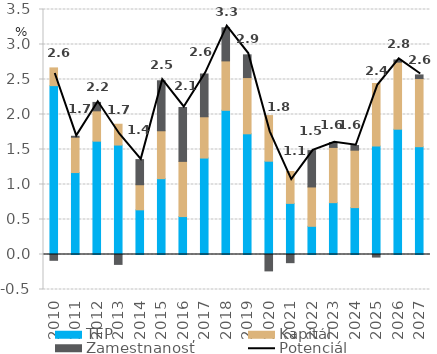
| Category | TFP | Kapitál | Zamestnanosť |
|---|---|---|---|
| 2010.0 | 2.412 | 0.253 | -0.083 |
| 2011.0 | 1.171 | 0.505 | 0.014 |
| 2012.0 | 1.619 | 0.434 | 0.12 |
| 2013.0 | 1.564 | 0.297 | -0.141 |
| 2014.0 | 0.638 | 0.359 | 0.359 |
| 2015.0 | 1.083 | 0.685 | 0.714 |
| 2016.0 | 0.542 | 0.789 | 0.769 |
| 2017.0 | 1.378 | 0.59 | 0.611 |
| 2018.0 | 2.06 | 0.706 | 0.473 |
| 2019.0 | 1.724 | 0.803 | 0.325 |
| 2020.0 | 1.333 | 0.651 | -0.234 |
| 2021.0 | 0.73 | 0.455 | -0.117 |
| 2022.0 | 0.403 | 0.562 | 0.52 |
| 2023.0 | 0.741 | 0.789 | 0.07 |
| 2024.0 | 0.67 | 0.82 | 0.066 |
| 2025.0 | 1.55 | 0.893 | -0.037 |
| 2026.0 | 1.79 | 0.958 | 0.03 |
| 2027.0 | 1.54 | 0.973 | 0.052 |